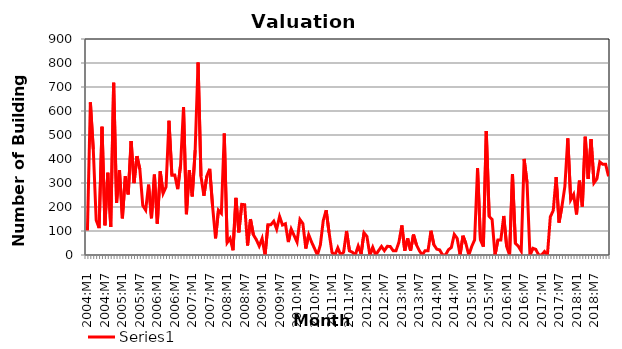
| Category | Series 0 |
|---|---|
| 2004:M1 | 102.125 |
| 2004:M2 | 635.875 |
| 2004:M3 | 440.75 |
| 2004:M4 | 144.5 |
| 2004:M5 | 112.125 |
| 2004:M6 | 534.5 |
| 2004:M7 | 123.75 |
| 2004:M8 | 342.75 |
| 2004:M9 | 117.125 |
| 2004:M10 | 717.75 |
| 2004:M11 | 216.875 |
| 2004:M12 | 354.125 |
| 2005:M1 | 153 |
| 2005:M2 | 327.625 |
| 2005:M3 | 252.375 |
| 2005:M4 | 475 |
| 2005:M5 | 299.625 |
| 2005:M6 | 411.875 |
| 2005:M7 | 357.25 |
| 2005:M8 | 206.25 |
| 2005:M9 | 187.125 |
| 2005:M10 | 292.875 |
| 2005:M11 | 153.125 |
| 2005:M12 | 334.625 |
| 2006:M1 | 130.875 |
| 2006:M2 | 348.625 |
| 2006:M3 | 257 |
| 2006:M4 | 284.125 |
| 2006:M5 | 559.5 |
| 2006:M6 | 333 |
| 2006:M7 | 333.5 |
| 2006:M8 | 274.375 |
| 2006:M9 | 375.875 |
| 2006:M10 | 616.375 |
| 2006:M11 | 170.125 |
| 2006:M12 | 353.625 |
| 2007:M1 | 244.125 |
| 2007:M2 | 436.75 |
| 2007:M3 | 802.375 |
| 2007:M4 | 327.5 |
| 2007:M5 | 247.125 |
| 2007:M6 | 328.5 |
| 2007:M7 | 359.125 |
| 2007:M8 | 200.25 |
| 2007:M9 | 69.625 |
| 2007:M10 | 186.875 |
| 2007:M11 | 173.625 |
| 2007:M12 | 506.125 |
| 2008:M1 | 51.625 |
| 2008:M2 | 69.375 |
| 2008:M3 | 19.75 |
| 2008:M4 | 238.25 |
| 2008:M5 | 94.5 |
| 2008:M6 | 210.875 |
| 2008:M7 | 209.5 |
| 2008:M8 | 39.625 |
| 2008:M9 | 149.625 |
| 2008:M10 | 84.125 |
| 2008:M11 | 64.25 |
| 2008:M12 | 37.375 |
| 2009:M1 | 68.875 |
| 2009:M2 | 0 |
| 2009:M3 | 126.375 |
| 2009:M4 | 126.25 |
| 2009:M5 | 140.75 |
| 2009:M6 | 107.75 |
| 2009:M7 | 160.5 |
| 2009:M8 | 124.875 |
| 2009:M9 | 130.125 |
| 2009:M10 | 53.875 |
| 2009:M11 | 107.75 |
| 2009:M12 | 80.75 |
| 2010:M1 | 53.875 |
| 2010:M2 | 148 |
| 2010:M3 | 130.875 |
| 2010:M4 | 27 |
| 2010:M5 | 84 |
| 2010:M6 | 53.625 |
| 2010:M7 | 27.125 |
| 2010:M8 | 0 |
| 2010:M9 | 41.5 |
| 2010:M10 | 143.375 |
| 2010:M11 | 186.5 |
| 2010:M12 | 93 |
| 2011:M1 | 10.75 |
| 2011:M2 | 0 |
| 2011:M3 | 29.625 |
| 2011:M4 | 0 |
| 2011:M5 | 11.5 |
| 2011:M6 | 100.125 |
| 2011:M7 | 17.125 |
| 2011:M8 | 11.5 |
| 2011:M9 | 0 |
| 2011:M10 | 37.25 |
| 2011:M11 | 3.75 |
| 2011:M12 | 92.625 |
| 2012:M1 | 77.375 |
| 2012:M2 | 0 |
| 2012:M3 | 32.125 |
| 2012:M4 | 0 |
| 2012:M5 | 18.125 |
| 2012:M6 | 35.625 |
| 2012:M7 | 18.125 |
| 2012:M8 | 36.125 |
| 2012:M9 | 35.625 |
| 2012:M10 | 18.125 |
| 2012:M11 | 18.125 |
| 2012:M12 | 54.25 |
| 2013:M1 | 123.125 |
| 2013:M2 | 18.125 |
| 2013:M3 | 69.25 |
| 2013:M4 | 18.125 |
| 2013:M5 | 85.125 |
| 2013:M6 | 42.5 |
| 2013:M7 | 18.125 |
| 2013:M8 | 0 |
| 2013:M9 | 18.125 |
| 2013:M10 | 18.125 |
| 2013:M11 | 101 |
| 2013:M12 | 42.5 |
| 2014:M1 | 24.375 |
| 2014:M2 | 21.125 |
| 2014:M3 | 0 |
| 2014:M4 | 0 |
| 2014:M5 | 21.875 |
| 2014:M6 | 31.25 |
| 2014:M7 | 85.75 |
| 2014:M8 | 69.375 |
| 2014:M9 | 0 |
| 2014:M10 | 80.25 |
| 2014:M11 | 47.25 |
| 2014:M12 | 0 |
| 2015:M1 | 35.714 |
| 2015:M2 | 62.714 |
| 2015:M3 | 361.429 |
| 2015:M4 | 62.714 |
| 2015:M5 | 34.857 |
| 2015:M6 | 516.714 |
| 2015:M7 | 160.571 |
| 2015:M8 | 148.571 |
| 2015:M9 | 0 |
| 2015:M10 | 62.714 |
| 2015:M11 | 62.714 |
| 2015:M12 | 162.571 |
| 2016:M1 | 35.714 |
| 2016:M2 | 0 |
| 2016:M3 | 337.714 |
| 2016:M4 | 48.571 |
| 2016:M5 | 36.286 |
| 2016:M6 | 16 |
| 2016:M7 | 400.286 |
| 2016:M8 | 301.571 |
| 2016:M9 | 0 |
| 2016:M10 | 28 |
| 2016:M11 | 23.571 |
| 2016:M12 | 0 |
| 2017:M1 | 0 |
| 2017:M2 | 14.429 |
| 2017:M3 | 0 |
| 2017:M4 | 158.857 |
| 2017:M5 | 185.429 |
| 2017:M6 | 324.143 |
| 2017:M7 | 135.143 |
| 2017:M8 | 202.857 |
| 2017:M9 | 286 |
| 2017:M10 | 485.857 |
| 2017:M11 | 230 |
| 2017:M12 | 252.286 |
| 2018:M1 | 169 |
| 2018:M2 | 309.714 |
| 2018:M3 | 202.143 |
| 2018:M4 | 492.714 |
| 2018:M5 | 317.143 |
| 2018:M6 | 482.429 |
| 2018:M7 | 300.286 |
| 2018:M8 | 317.143 |
| 2018:M9 | 387.857 |
| 2018:M10 | 377.857 |
| 2018:M11 | 377.857 |
| 2018:M12 | 327.857 |